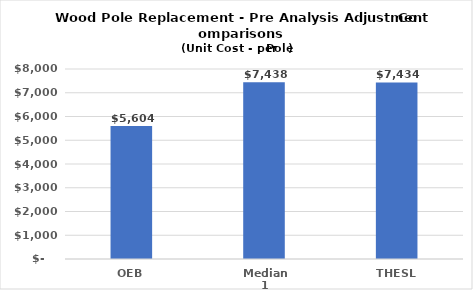
| Category | Series 0 |
|---|---|
| OEB | 5604 |
| Median 1 | 7437.936 |
| THESL | 7434 |